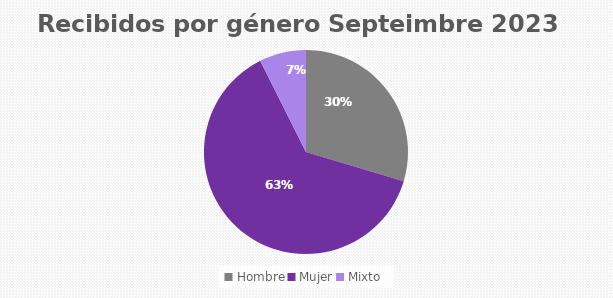
| Category | Recibidos por género  SEPTEIMBRE |
|---|---|
| Hombre | 8 |
| Mujer | 17 |
| Mixto | 2 |